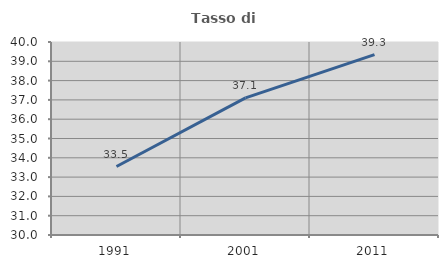
| Category | Tasso di occupazione   |
|---|---|
| 1991.0 | 33.549 |
| 2001.0 | 37.102 |
| 2011.0 | 39.35 |